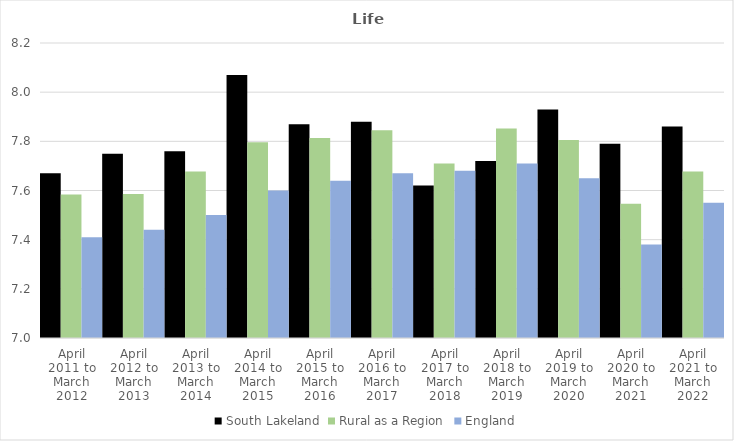
| Category | South Lakeland | Rural as a Region | England |
|---|---|---|---|
| April 2011 to March 2012 | 7.67 | 7.584 | 7.41 |
| April 2012 to March 2013 | 7.75 | 7.586 | 7.44 |
| April 2013 to March 2014 | 7.76 | 7.677 | 7.5 |
| April 2014 to March 2015 | 8.07 | 7.797 | 7.6 |
| April 2015 to March 2016 | 7.87 | 7.813 | 7.64 |
| April 2016 to March 2017 | 7.88 | 7.845 | 7.67 |
| April 2017 to March 2018 | 7.62 | 7.71 | 7.68 |
| April 2018 to March 2019 | 7.72 | 7.852 | 7.71 |
| April 2019 to March 2020 | 7.93 | 7.806 | 7.65 |
| April 2020 to March 2021 | 7.79 | 7.546 | 7.38 |
| April 2021 to March 2022 | 7.86 | 7.677 | 7.55 |